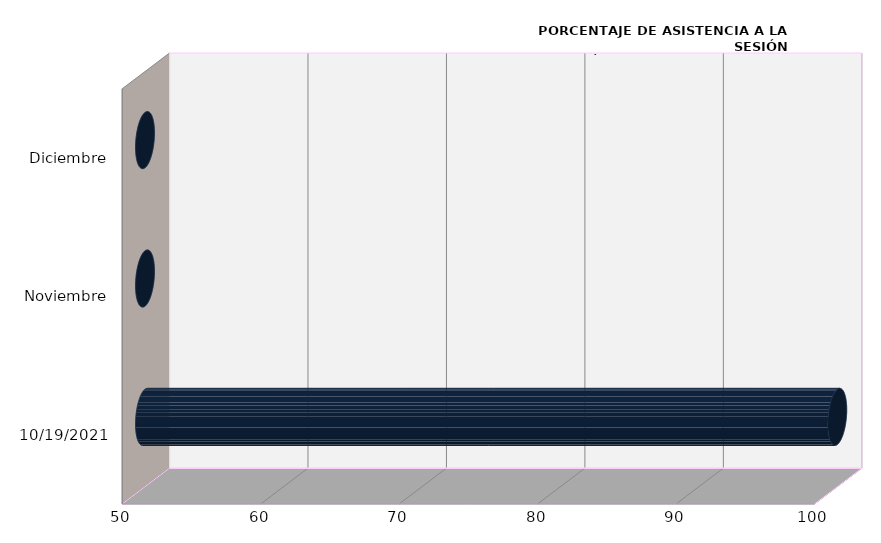
| Category | Series 0 |
|---|---|
| 19/10/2021 | 100 |
| Noviembre | 0 |
| Diciembre | 0 |